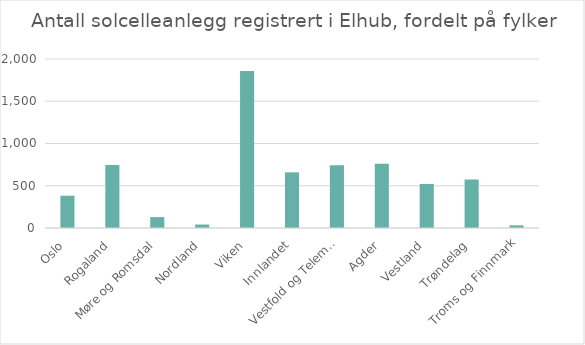
| Category | Antall anlegg |
|---|---|
| Oslo | 382 |
| Rogaland | 746 |
| Møre og Romsdal | 129 |
| Nordland | 41 |
| Viken | 1859 |
| Innlandet | 659 |
| Vestfold og Telemark | 743 |
| Agder | 759 |
| Vestland | 521 |
| Trøndelag | 574 |
| Troms og Finnmark | 32 |